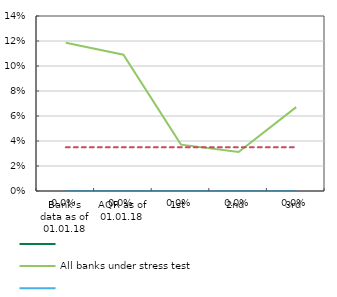
| Category | Series 0 | All banks under stress test | Series 3 | Required level of core capital ratio under adverse scenario |
|---|---|---|---|---|
| Bank's data as of 01.01.18 | 0 | 0.119 | 0 | 0.035 |
| AQR as of 01.01.18 | 0 | 0.109 | 0 | 0.035 |
| 1st | 0 | 0.037 | 0 | 0.035 |
| 2nd | 0 | 0.031 | 0 | 0.035 |
| 3rd | 0 | 0.067 | 0 | 0.035 |